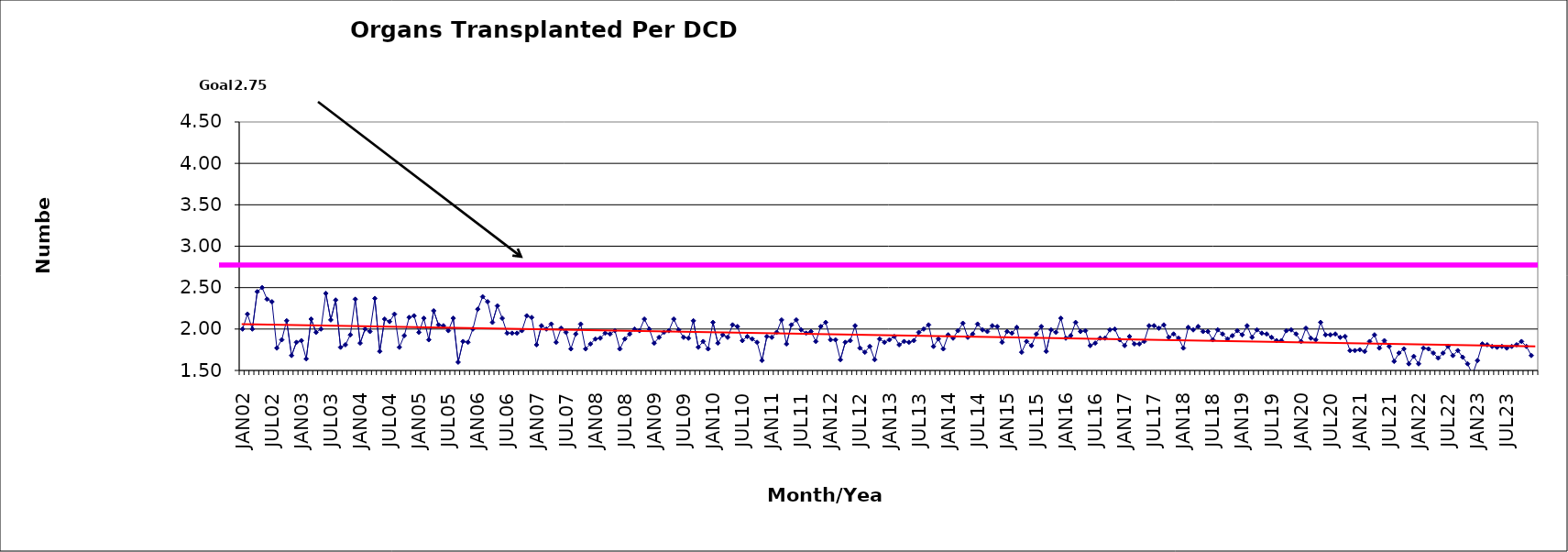
| Category | Series 0 |
|---|---|
| JAN02 | 2 |
| FEB02 | 2.18 |
| MAR02 | 2 |
| APR02 | 2.45 |
| MAY02 | 2.5 |
| JUN02 | 2.36 |
| JUL02 | 2.33 |
| AUG02 | 1.77 |
| SEP02 | 1.87 |
| OCT02 | 2.1 |
| NOV02 | 1.68 |
| DEC02 | 1.84 |
| JAN03 | 1.86 |
| FEB03 | 1.64 |
| MAR03 | 2.12 |
| APR03 | 1.96 |
| MAY03 | 2 |
| JUN03 | 2.43 |
| JUL03 | 2.11 |
| AUG03 | 2.35 |
| SEP03 | 1.78 |
| OCT03 | 1.81 |
| NOV03 | 1.93 |
| DEC03 | 2.36 |
| JAN04 | 1.83 |
| FEB04 | 2 |
| MAR04 | 1.97 |
| APR04 | 2.37 |
| MAY04 | 1.73 |
| JUN04 | 2.12 |
| JUL04 | 2.09 |
| AUG04 | 2.18 |
| SEP04 | 1.78 |
| OCT04 | 1.92 |
| NOV04 | 2.14 |
| DEC04 | 2.16 |
| JAN05 | 1.96 |
| FEB05 | 2.13 |
| MAR05 | 1.87 |
| APR05 | 2.22 |
| MAY05 | 2.05 |
| JUN05 | 2.04 |
| JUL05 | 1.98 |
| AUG05 | 2.13 |
| SEP05 | 1.6 |
| OCT05 | 1.85 |
| NOV05 | 1.84 |
| DEC05 | 2 |
| JAN06 | 2.24 |
| FEB06 | 2.39 |
| MAR06 | 2.33 |
| APR06 | 2.08 |
| MAY06 | 2.28 |
| JUN06 | 2.13 |
| JUL06 | 1.95 |
| AUG06 | 1.95 |
| SEP06 | 1.95 |
| OCT06 | 1.98 |
| NOV06 | 2.16 |
| DEC06 | 2.14 |
| JAN07 | 1.81 |
| FEB07 | 2.04 |
| MAR07 | 2 |
| APR07 | 2.06 |
| MAY07 | 1.84 |
| JUN07 | 2.01 |
| JUL07 | 1.96 |
| AUG07 | 1.76 |
| SEP07 | 1.94 |
| OCT07 | 2.06 |
| NOV07 | 1.76 |
| DEC07 | 1.82 |
| JAN08 | 1.88 |
| FEB08 | 1.89 |
| MAR08 | 1.95 |
| APR08 | 1.94 |
| MAY08 | 1.98 |
| JUN08 | 1.76 |
| JUL08 | 1.88 |
| AUG08 | 1.94 |
| SEP08 | 2 |
| OCT08 | 1.98 |
| NOV08 | 2.12 |
| DEC08 | 2 |
| JAN09 | 1.83 |
| FEB09 | 1.9 |
| MAR09 | 1.96 |
| APR09 | 1.98 |
| MAY09 | 2.12 |
| JUN09 | 1.99 |
| JUL09 | 1.9 |
| AUG09 | 1.89 |
| SEP09 | 2.1 |
| OCT09 | 1.78 |
| NOV09 | 1.85 |
| DEC09 | 1.76 |
| JAN10 | 2.08 |
| FEB10 | 1.83 |
| MAR10 | 1.93 |
| APR10 | 1.9 |
| MAY10 | 2.05 |
| JUN10 | 2.03 |
| JUL10 | 1.86 |
| AUG10 | 1.91 |
| SEP10 | 1.88 |
| OCT10 | 1.84 |
| NOV10 | 1.62 |
| DEC10 | 1.91 |
| JAN11 | 1.9 |
| FEB11 | 1.96 |
| MAR11 | 2.11 |
| APR11 | 1.82 |
| MAY11 | 2.05 |
| JUN11 | 2.11 |
| JUL11 | 1.99 |
| AUG11 | 1.95 |
| SEP11 | 1.97 |
| OCT11 | 1.85 |
| NOV11 | 2.03 |
| DEC11 | 2.08 |
| JAN12 | 1.87 |
| FEB12 | 1.87 |
| MAR12 | 1.63 |
| APR12 | 1.84 |
| MAY12 | 1.86 |
| JUN12 | 2.04 |
| JUL12 | 1.77 |
| AUG12 | 1.72 |
| SEP12 | 1.79 |
| OCT12 | 1.63 |
| NOV12 | 1.88 |
| DEC12 | 1.84 |
| JAN13 | 1.87 |
| FEB13 | 1.91 |
| MAR13 | 1.81 |
| APR13 | 1.85 |
| MAY13 | 1.84 |
| JUN13 | 1.86 |
| JUL13 | 1.96 |
| AUG13 | 2 |
| SEP13 | 2.05 |
| OCT13 | 1.79 |
| NOV13 | 1.88 |
| DEC13 | 1.76 |
| JAN14 | 1.93 |
| FEB14 | 1.89 |
| MAR14 | 1.98 |
| APR14 | 2.07 |
| MAY14 | 1.9 |
| JUN14 | 1.94 |
| JUL14 | 2.06 |
| AUG14 | 1.99 |
| SEP14 | 1.97 |
| OCT14 | 2.04 |
| NOV14 | 2.03 |
| DEC14 | 1.84 |
| JAN15 | 1.97 |
| FEB15 | 1.95 |
| MAR15 | 2.02 |
| APR15 | 1.72 |
| MAY15 | 1.85 |
| JUN15 | 1.8 |
| JUL15 | 1.94 |
| AUG15 | 2.03 |
| SEP15 | 1.73 |
| OCT15 | 1.99 |
| NOV15 | 1.96 |
| DEC15 | 2.13 |
| JAN16 | 1.89 |
| FEB16 | 1.92 |
| MAR16 | 2.08 |
| APR16 | 1.97 |
| MAY16 | 1.98 |
| JUN16 | 1.8 |
| JUL16 | 1.83 |
| AUG16 | 1.89 |
| SEP16 | 1.89 |
| OCT16 | 1.99 |
| NOV16 | 2 |
| DEC16 | 1.87 |
| JAN17 | 1.8 |
| FEB17 | 1.91 |
| MAR17 | 1.82 |
| APR17 | 1.82 |
| MAY17 | 1.85 |
| JUN17 | 2.04 |
| JUL17 | 2.04 |
| AUG17 | 2.01 |
| SEP17 | 2.05 |
| OCT17 | 1.9 |
| NOV17 | 1.94 |
| DEC17 | 1.89 |
| JAN18 | 1.77 |
| FEB18 | 2.02 |
| MAR18 | 1.99 |
| APR18 | 2.03 |
| MAY18 | 1.97 |
| JUN18 | 1.97 |
| JUL18 | 1.87 |
| AUG18 | 1.99 |
| SEP18 | 1.94 |
| OCT18 | 1.88 |
| NOV18 | 1.92 |
| DEC18 | 1.98 |
| JAN19 | 1.93 |
| FEB19 | 2.04 |
| MAR19 | 1.9 |
| APR19 | 1.99 |
| MAY19 | 1.95 |
| JUN19 | 1.94 |
| JUL19 | 1.9 |
| AUG19 | 1.86 |
| SEP19 | 1.86 |
| OCT19 | 1.98 |
| NOV19 | 1.99 |
| DEC19 | 1.94 |
| JAN20 | 1.85 |
| FEB20 | 2.01 |
| MAR20 | 1.89 |
| APR20 | 1.87 |
| MAY20 | 2.08 |
| JUN20 | 1.93 |
| JUL20 | 1.93 |
| AUG20 | 1.94 |
| SEP20 | 1.9 |
| OCT20 | 1.91 |
| NOV20 | 1.74 |
| DEC20 | 1.74 |
| JAN21 | 1.75 |
| FEB21 | 1.73 |
| MAR21 | 1.85 |
| APR21 | 1.93 |
| MAY21 | 1.77 |
| JUN21 | 1.86 |
| JUL21 | 1.79 |
| AUG21 | 1.61 |
| SEP21 | 1.71 |
| OCT21 | 1.76 |
| NOV21 | 1.58 |
| DEC21 | 1.67 |
| JAN22 | 1.58 |
| FEB22 | 1.77 |
| MAR22 | 1.76 |
| APR22 | 1.71 |
| MAY22 | 1.65 |
| JUN22 | 1.71 |
| JUL22 | 1.79 |
| AUG22 | 1.68 |
| SEP22 | 1.74 |
| OCT22 | 1.66 |
| NOV22 | 1.58 |
| DEC22 | 1.45 |
| JAN23 | 1.62 |
| FEB23 | 1.82 |
| MAR23 | 1.81 |
| APR23 | 1.79 |
| MAY23 | 1.78 |
| JUN23 | 1.79 |
| JUL23 | 1.77 |
| AUG23 | 1.79 |
| SEP23 | 1.81 |
| OCT23 | 1.85 |
| NOV23 | 1.79 |
| DEC23 | 1.68 |